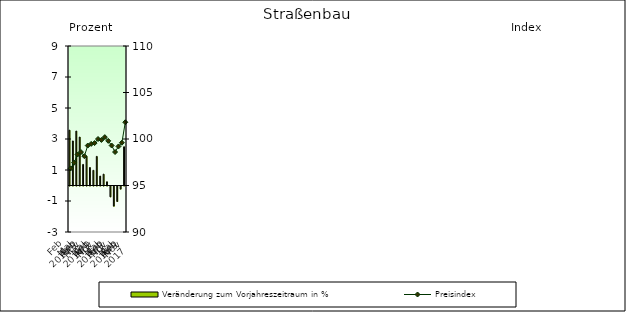
| Category | Veränderung zum Vorjahreszeitraum in % |
|---|---|
| 0 | 3.568 |
| 1 | 2.873 |
| 2 | 3.512 |
| 3 | 3.122 |
| 4 | 1.36 |
| 5 | 1.892 |
| 6 | 1.161 |
| 7 | 0.98 |
| 8 | 1.878 |
| 9 | 0.607 |
| 10 | 0.731 |
| 11 | 0.24 |
| 12 | -0.7 |
| 13 | -1.3 |
| 14 | -1 |
| 15 | -0.2 |
| 16 | 2.5 |